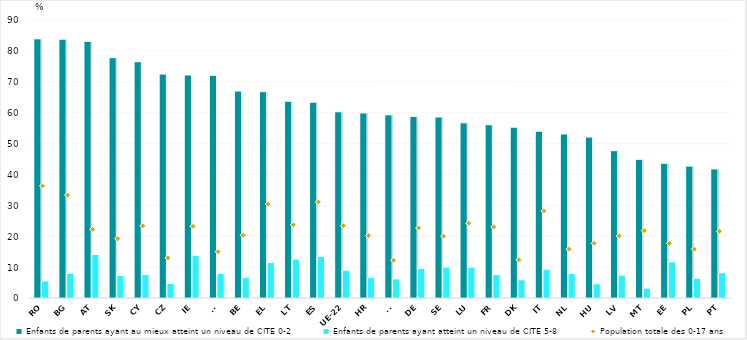
| Category | Enfants de parents ayant au mieux atteint un niveau de CITE 0-2 | Enfants de parents ayant atteint un niveau de CITE 5-8 |
|---|---|---|
| RO | 83.9 | 5.5 |
| BG | 83.8 | 8 |
| AT | 83.1 | 14.1 |
| SK | 77.8 | 7.3 |
| CY | 76.5 | 7.6 |
| CZ | 72.5 | 4.7 |
| IE | 72.2 | 13.8 |
| FI | 72.1 | 7.9 |
| BE | 67 | 6.6 |
| EL | 66.8 | 11.5 |
| LT | 63.7 | 12.6 |
| ES | 63.4 | 13.5 |
| UE-22 | 60.3 | 9 |
| HR | 59.9 | 6.6 |
| SI | 59.3 | 6.2 |
| DE | 58.8 | 9.6 |
| SE | 58.6 | 10 |
| LU | 56.7 | 10 |
| FR | 56.1 | 7.6 |
| DK | 55.3 | 5.9 |
| IT | 54 | 9.3 |
| NL | 53.1 | 7.9 |
| HU | 52.1 | 4.6 |
| LV | 47.7 | 7.4 |
| MT | 44.9 | 3.2 |
| EE | 43.6 | 11.7 |
| PL | 42.7 | 6.4 |
| PT | 41.8 | 8.2 |